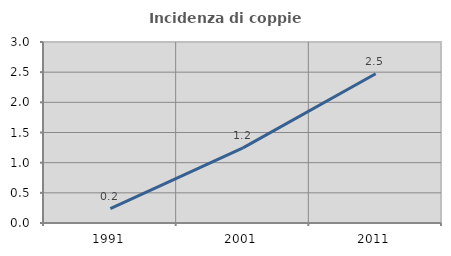
| Category | Incidenza di coppie miste |
|---|---|
| 1991.0 | 0.24 |
| 2001.0 | 1.245 |
| 2011.0 | 2.474 |